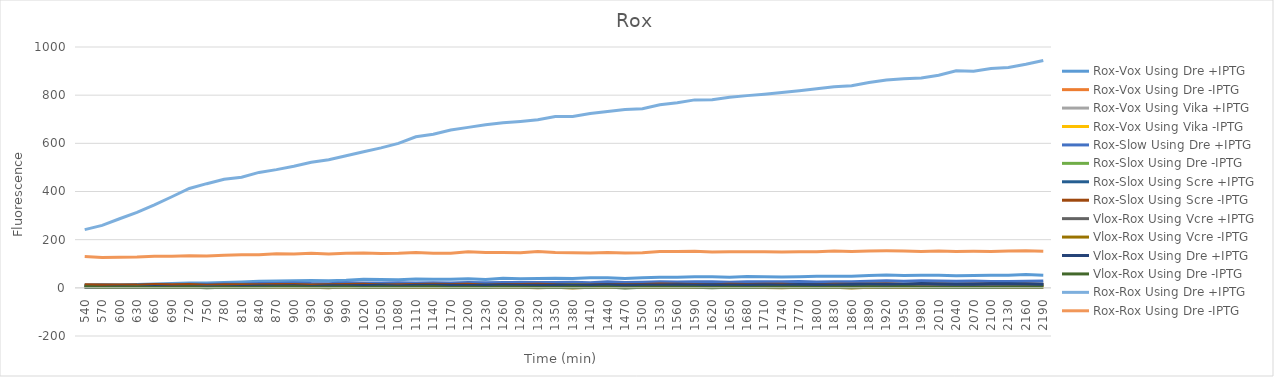
| Category | Rox-Vox Using Dre +IPTG | Rox-Vox Using Dre -IPTG | Rox-Vox Using Vika +IPTG | Rox-Vox Using Vika -IPTG | Rox-Slow Using Dre +IPTG | Rox-Slox Using Dre -IPTG | Rox-Slox Using Scre +IPTG | Rox-Slox Using Scre -IPTG | Vlox-Rox Using Vcre +IPTG | Vlox-Rox Using Vcre -IPTG | Vlox-Rox Using Dre +IPTG | Vlox-Rox Using Dre -IPTG | Rox-Rox Using Dre +IPTG | Rox-Rox Using Dre -IPTG |
|---|---|---|---|---|---|---|---|---|---|---|---|---|---|---|
| 540.0 | 10.25 | 4.5 | 10.25 | 6.75 | 7.75 | 10 | 10.5 | 13.25 | 1.5 | 2.75 | 2.5 | 4.5 | 241.75 | 130.25 |
| 570.0 | 12 | 2.5 | 10.5 | 5.25 | 9 | 9.5 | 12 | 11.5 | 1.5 | 1.25 | 2.75 | 1.75 | 259.5 | 126 |
| 600.0 | 11.5 | 2.5 | 11.5 | 5 | 9 | 9.75 | 10.5 | 12.25 | 2.25 | 1.5 | 3.25 | 2.25 | 286.75 | 127.5 |
| 630.0 | 14.25 | 3.75 | 10.5 | 5.25 | 9.25 | 10 | 11.25 | 11.25 | 3.75 | 2 | 2.5 | 2 | 313 | 128.25 |
| 660.0 | 16.375 | 1.875 | 12.875 | 6.625 | 12.375 | 9.625 | 12.875 | 14.125 | 5.125 | 1.625 | 5.875 | 1.625 | 344.625 | 131.375 |
| 690.0 | 17.5 | 2.75 | 11.25 | 3.75 | 11.25 | 8.75 | 9.5 | 12.75 | 2.5 | 1.5 | 3.5 | 1.5 | 378.25 | 131 |
| 720.0 | 20.125 | 4.375 | 11.625 | 8.625 | 15.375 | 12.375 | 10.625 | 14.125 | 4.875 | 4.125 | 4.875 | 3.625 | 412.625 | 132.875 |
| 750.0 | 20.5 | 2.5 | 12.25 | 5.25 | 14.25 | 9 | 10.5 | 10.75 | 4 | 2.5 | 3.5 | 0.25 | 432.5 | 132.25 |
| 780.0 | 22.125 | 1.875 | 12.375 | 6.125 | 15.625 | 9.375 | 11.875 | 12.375 | 4.625 | 2.375 | 4.375 | 2.125 | 450.625 | 135.375 |
| 810.0 | 24 | 3.25 | 13.5 | 4.25 | 15 | 11.25 | 12.25 | 12.5 | 4.25 | 3 | 5.5 | 1.5 | 459.5 | 137.25 |
| 840.0 | 27 | 4.75 | 13.25 | 7 | 18 | 9.75 | 11.25 | 13 | 5.25 | 2.75 | 7.25 | 2.5 | 479.25 | 137.75 |
| 870.0 | 28.25 | 4.5 | 13.75 | 6.75 | 17.75 | 11.5 | 12.75 | 14 | 6 | 2 | 7.5 | 3.75 | 490.75 | 141.25 |
| 900.0 | 29.5 | 4.25 | 15.75 | 5.5 | 20 | 12.25 | 12 | 13.5 | 4.5 | 2.5 | 8.75 | 4.5 | 504.75 | 140.5 |
| 930.0 | 30.875 | 3.375 | 14.375 | 5.125 | 17.875 | 9.625 | 10.875 | 12.125 | 4.875 | 2.375 | 5.875 | 2.125 | 521.625 | 143.125 |
| 960.0 | 29.625 | 2.625 | 13.375 | 6.875 | 17.375 | 8.625 | 13.375 | 12.375 | 5.375 | 0.625 | 8.375 | 2.125 | 531.875 | 140.625 |
| 990.0 | 31.25 | 2.25 | 13.25 | 5 | 21.25 | 9 | 12.75 | 13.5 | 6 | 5.5 | 8.25 | 3.25 | 548.25 | 143.25 |
| 1020.0 | 35.875 | 2.625 | 16.125 | 6.875 | 20.375 | 10.125 | 13.375 | 15.375 | 5.125 | 1.375 | 9.875 | 1.625 | 564.875 | 144.625 |
| 1050.0 | 34.375 | 1.875 | 14.375 | 4.875 | 19.875 | 10.125 | 14.125 | 11.375 | 7.875 | 0.875 | 9.375 | 3.375 | 581.125 | 142.875 |
| 1080.0 | 33.375 | 3.125 | 14.625 | 4.375 | 20.625 | 8.625 | 10.625 | 12.625 | 6.125 | 1.125 | 7.875 | 2.875 | 599.625 | 143.625 |
| 1110.0 | 36.5 | 4.5 | 15.75 | 6 | 20 | 10 | 12.25 | 14.25 | 8 | 1.75 | 10.75 | 3.75 | 627.25 | 146.75 |
| 1140.0 | 35.5 | 4.25 | 16.25 | 6.5 | 21 | 10.75 | 14.25 | 14.5 | 9.25 | 2.75 | 10.5 | 4 | 637.75 | 144 |
| 1170.0 | 35.375 | 3.125 | 16.375 | 5.125 | 20.125 | 9.625 | 11.125 | 13.875 | 7.375 | 1.625 | 10.875 | 1.375 | 655.625 | 143.125 |
| 1200.0 | 38 | 2.25 | 14 | 6.25 | 21.75 | 11.5 | 13.75 | 14.5 | 6.75 | 2.25 | 9.5 | 2.5 | 666.25 | 149.5 |
| 1230.0 | 34.875 | 3.875 | 13.125 | 4.125 | 21.375 | 9.875 | 12.625 | 10.875 | 5.625 | 3.125 | 9.375 | 1.375 | 676.875 | 146.875 |
| 1260.0 | 39.375 | 4.125 | 16.875 | 6.625 | 21.875 | 10.375 | 12.375 | 13.625 | 7.625 | 2.125 | 11.375 | 3.625 | 685.375 | 146.625 |
| 1290.0 | 37.75 | 5 | 16.25 | 7.25 | 22.25 | 10 | 12.5 | 13.75 | 6.75 | 2.25 | 11 | 2 | 690.75 | 145.25 |
| 1320.0 | 38.375 | 3.625 | 14.875 | 6.875 | 22.125 | 10.875 | 13.625 | 14.375 | 8.375 | 0.625 | 11.125 | 1.125 | 697.625 | 150.375 |
| 1350.0 | 40.125 | 2.875 | 15.625 | 5.625 | 22.375 | 11.125 | 14.125 | 12.375 | 7.125 | 2.125 | 10.625 | 1.875 | 711.625 | 146.625 |
| 1380.0 | 39 | 2.25 | 15.25 | 7 | 23 | 13.75 | 11 | 12.25 | 7.5 | -0.75 | 10.75 | 2.75 | 711.5 | 146 |
| 1410.0 | 41.875 | 1.125 | 17.125 | 6.125 | 21.375 | 10.875 | 11.625 | 12.125 | 7.125 | 2.625 | 10.875 | 1.625 | 723.625 | 145.125 |
| 1440.0 | 41.375 | 3.875 | 16.625 | 8.375 | 25.375 | 11.625 | 13.875 | 13.375 | 7.375 | 2.875 | 12.375 | 3.375 | 732.625 | 146.375 |
| 1470.0 | 38.625 | 4.375 | 17.875 | 5.125 | 22.125 | 12.625 | 13.125 | 13.125 | 6.375 | 1.875 | 11.125 | -0.375 | 740.375 | 144.375 |
| 1500.0 | 42.375 | 2.375 | 16.125 | 6.125 | 22.875 | 11.625 | 12.875 | 13.875 | 9.125 | 2.625 | 11.875 | 2.625 | 743.875 | 146.125 |
| 1530.0 | 43.75 | 3 | 18 | 7.25 | 24.75 | 12.25 | 13 | 16 | 10 | 1.5 | 12.25 | 2.75 | 760.25 | 151 |
| 1560.0 | 43.5 | 4.25 | 18 | 8.25 | 24.5 | 12 | 14.75 | 15 | 9.25 | 3 | 12.5 | 2 | 768.75 | 150.75 |
| 1590.0 | 45.625 | 2.125 | 19.625 | 6.625 | 25.125 | 11.625 | 12.625 | 14.125 | 8.625 | 0.875 | 11.875 | 2.375 | 780.375 | 151.625 |
| 1620.0 | 46 | 1.25 | 17.75 | 6.5 | 25.5 | 12 | 12 | 12.5 | 9.75 | 2 | 13 | 0.75 | 781.25 | 148.5 |
| 1650.0 | 43.625 | 2.375 | 16.375 | 5.375 | 23.625 | 11.125 | 12.125 | 15.375 | 8.125 | 2.125 | 12.125 | 2.875 | 791.125 | 150.125 |
| 1680.0 | 47.125 | 4.375 | 19.125 | 7.875 | 25.375 | 11.375 | 11.375 | 13.375 | 8.375 | 1.625 | 12.125 | 1.625 | 798.125 | 149.375 |
| 1710.0 | 45.625 | 3.875 | 17.875 | 6.875 | 24.875 | 12.375 | 13.125 | 14.375 | 10.375 | 1.875 | 12.875 | 2.625 | 804.125 | 149.625 |
| 1740.0 | 45.5 | 2 | 19 | 6.75 | 25 | 11.5 | 11.25 | 14.5 | 8.5 | 0.5 | 11.25 | 2.25 | 811 | 149.25 |
| 1770.0 | 46.25 | 3 | 18.5 | 6.25 | 26.25 | 12.75 | 12.25 | 13 | 10 | 2.5 | 13.5 | 2.75 | 818 | 150 |
| 1800.0 | 48.125 | 4.375 | 19.625 | 5.625 | 24.625 | 11.875 | 13.375 | 12.375 | 8.625 | 1.375 | 12.625 | 1.875 | 826.375 | 149.875 |
| 1830.0 | 48.25 | 3 | 18 | 4 | 25.75 | 13.75 | 13.25 | 14.5 | 10.5 | 2 | 12.25 | 2 | 834.75 | 153.25 |
| 1860.0 | 48.375 | 1.375 | 16.875 | 5.375 | 25.375 | 10.375 | 12.625 | 14.375 | 10.375 | -0.625 | 14.125 | 2.375 | 839.375 | 150.375 |
| 1890.0 | 51.25 | 2.75 | 21.25 | 7 | 27.5 | 13.75 | 13.75 | 14.75 | 11.75 | 2 | 14.75 | 3.25 | 853 | 153.25 |
| 1920.0 | 52.875 | 4.375 | 19.125 | 6.125 | 29.125 | 13.625 | 13.625 | 15.625 | 12.875 | 1.125 | 14.375 | 2.625 | 862.875 | 153.875 |
| 1950.0 | 51.375 | 3.375 | 19.125 | 5.875 | 27.125 | 11.625 | 12.375 | 13.375 | 10.125 | 1.125 | 13.875 | 4.375 | 868.625 | 153.375 |
| 1980.0 | 52.25 | 3.5 | 21 | 5.5 | 29 | 11.25 | 11.75 | 13.5 | 12.25 | 2 | 17.75 | 1.5 | 871.25 | 150.75 |
| 2010.0 | 51.75 | 4.75 | 19.25 | 6.5 | 28.75 | 11.25 | 13 | 14.5 | 11.75 | 1 | 15.75 | 1.75 | 882.5 | 152.5 |
| 2040.0 | 50.375 | 1.625 | 21.875 | 6.375 | 26.875 | 11.125 | 13.625 | 13.875 | 11.625 | 1.875 | 14.875 | 1.375 | 901.625 | 151.125 |
| 2070.0 | 51.125 | 1.375 | 21.875 | 6.125 | 27.875 | 12.375 | 12.875 | 15.375 | 10.875 | 1.125 | 14.625 | 1.875 | 899.125 | 151.875 |
| 2100.0 | 52.75 | 3.25 | 21.5 | 6 | 26.75 | 13.5 | 12 | 15 | 10 | 1.75 | 16.75 | 1.25 | 910.75 | 151.25 |
| 2130.0 | 52.75 | 2.75 | 21.25 | 5.5 | 26.5 | 11.75 | 11.75 | 13 | 12 | 1.5 | 17.25 | 2 | 914.5 | 152.5 |
| 2160.0 | 55.375 | 3.625 | 21.625 | 7.125 | 27.125 | 11.625 | 13.375 | 15.375 | 12.875 | 2.625 | 16.375 | 2.125 | 928.375 | 154.125 |
| 2190.0 | 52.5 | 2.75 | 21.5 | 6.75 | 28 | 12.25 | 13 | 14.25 | 13.25 | 1 | 14 | 2.75 | 944 | 151.75 |